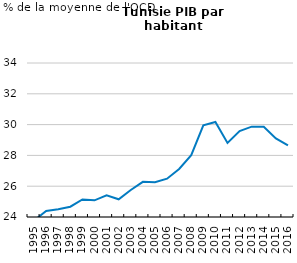
| Category | Tunisia |
|---|---|
| 1995.0 | 23.763 |
| 1996.0 | 24.397 |
| 1997.0 | 24.5 |
| 1998.0 | 24.67 |
| 1999.0 | 25.138 |
| 2000.0 | 25.081 |
| 2001.0 | 25.405 |
| 2002.0 | 25.15 |
| 2003.0 | 25.752 |
| 2004.0 | 26.283 |
| 2005.0 | 26.253 |
| 2006.0 | 26.487 |
| 2007.0 | 27.119 |
| 2008.0 | 28.015 |
| 2009.0 | 29.955 |
| 2010.0 | 30.172 |
| 2011.0 | 28.805 |
| 2012.0 | 29.577 |
| 2013.0 | 29.866 |
| 2014.0 | 29.854 |
| 2015.0 | 29.106 |
| 2016.0 | 28.647 |